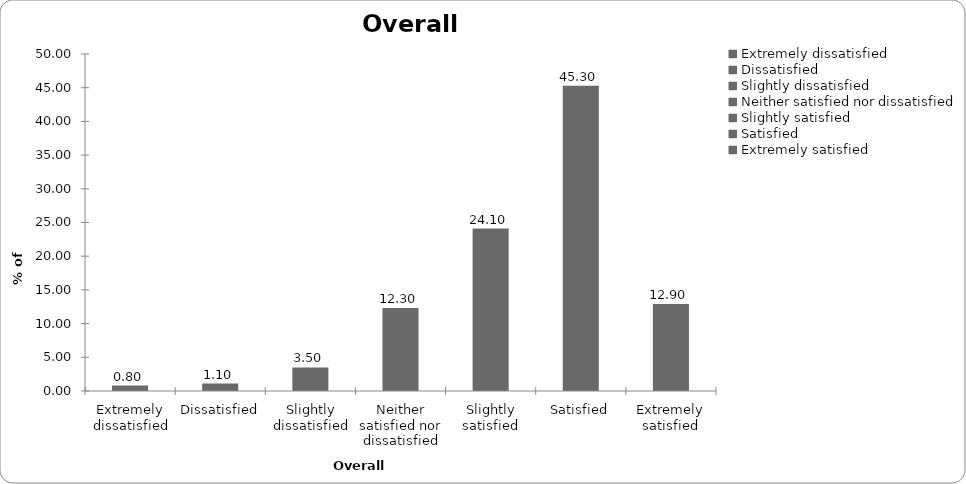
| Category | Overall satisfaction |
|---|---|
| Extremely dissatisfied | 0.8 |
| Dissatisfied | 1.1 |
| Slightly dissatisfied | 3.5 |
| Neither satisfied nor dissatisfied | 12.3 |
| Slightly satisfied | 24.1 |
| Satisfied | 45.3 |
| Extremely satisfied | 12.9 |